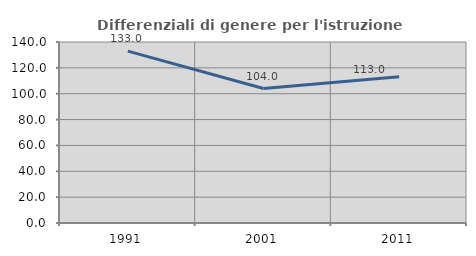
| Category | Differenziali di genere per l'istruzione superiore |
|---|---|
| 1991.0 | 132.955 |
| 2001.0 | 104.032 |
| 2011.0 | 113.035 |